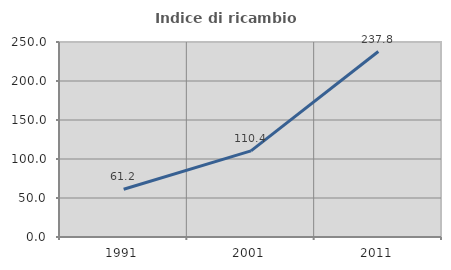
| Category | Indice di ricambio occupazionale  |
|---|---|
| 1991.0 | 61.159 |
| 2001.0 | 110.425 |
| 2011.0 | 237.774 |